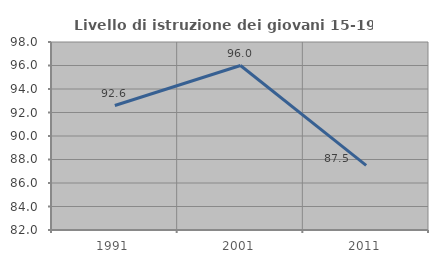
| Category | Livello di istruzione dei giovani 15-19 anni |
|---|---|
| 1991.0 | 92.593 |
| 2001.0 | 96 |
| 2011.0 | 87.5 |